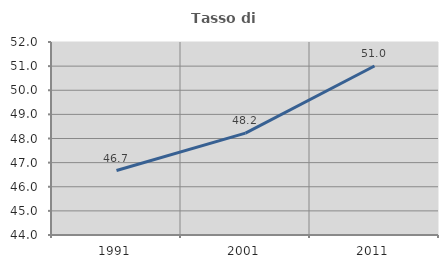
| Category | Tasso di occupazione   |
|---|---|
| 1991.0 | 46.671 |
| 2001.0 | 48.221 |
| 2011.0 | 51.005 |